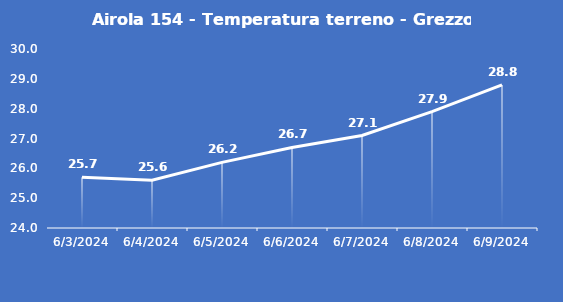
| Category | Airola 154 - Temperatura terreno - Grezzo (°C) |
|---|---|
| 6/3/24 | 25.7 |
| 6/4/24 | 25.6 |
| 6/5/24 | 26.2 |
| 6/6/24 | 26.7 |
| 6/7/24 | 27.1 |
| 6/8/24 | 27.9 |
| 6/9/24 | 28.8 |